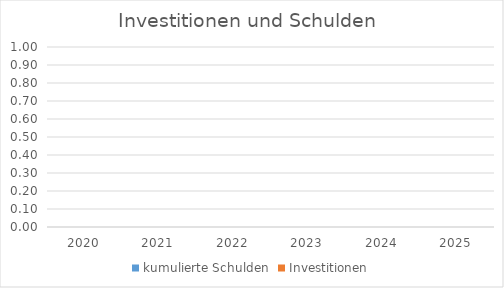
| Category | kumulierte Schulden | Investitionen  |
|---|---|---|
| 2020.0 | 0 | 0 |
| 2021.0 | 0 | 0 |
| 2022.0 | 0 | 0 |
| 2023.0 | 0 | 0 |
| 2024.0 | 0 | 0 |
| 2025.0 | 0 | 0 |